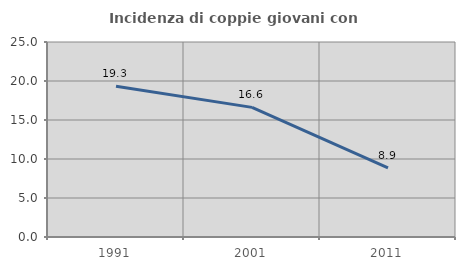
| Category | Incidenza di coppie giovani con figli |
|---|---|
| 1991.0 | 19.32 |
| 2001.0 | 16.619 |
| 2011.0 | 8.875 |